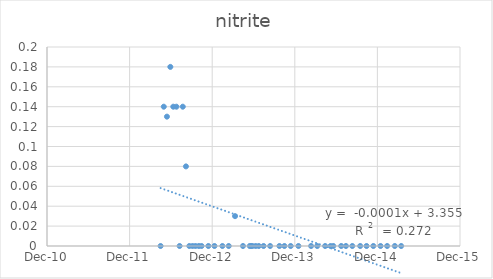
| Category | Series 0 |
|---|---|
| 41017.0 | 0 |
| 41031.0 | 0.14 |
| 41045.0 | 0.13 |
| 41060.0 | 0.18 |
| 41073.0 | 0.14 |
| 41087.0 | 0.14 |
| 41101.0 | 0 |
| 41115.0 | 0.14 |
| 41129.0 | 0.08 |
| 41144.0 | 0 |
| 41158.0 | 0 |
| 41171.0 | 0 |
| 41186.0 | 0 |
| 41198.0 | 0 |
| 41228.0 | 0 |
| 41255.0 | 0 |
| 41290.0 | 0 |
| 41318.0 | 0 |
| 41346.0 | 0.03 |
| 41381.0 | 0 |
| 41411.0 | 0 |
| 41417.0 | 0 |
| 41423.0 | 0 |
| 41437.0 | 0 |
| 41451.0 | 0 |
| 41472.0 | 0 |
| 41501.0 | 0 |
| 41542.0 | 0 |
| 41564.0 | 0 |
| 41592.0 | 0 |
| 41626.0 | 0 |
| 41682.0 | 0 |
| 41709.0 | 0 |
| 41744.0 | 0 |
| 41768.0 | 0 |
| 41780.0 | 0 |
| 41815.0 | 0 |
| 41836.0 | 0 |
| 41864.0 | 0 |
| 41899.0 | 0 |
| 41927.0 | 0 |
| 41957.0 | 0 |
| 41989.0 | 0 |
| 42018.0 | 0 |
| 42052.0 | 0 |
| 42080.0 | 0 |